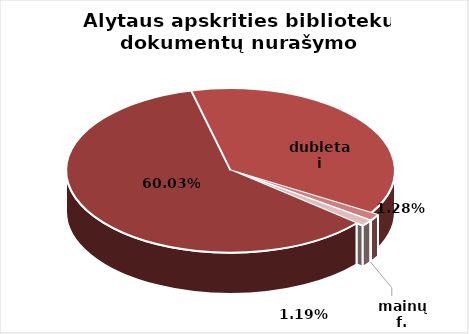
| Category | Series 0 |
|---|---|
| 0 | 34312 |
| 1 | 21430 |
| 2 | 733 |
| 3 | 0 |
| 4 | 683 |